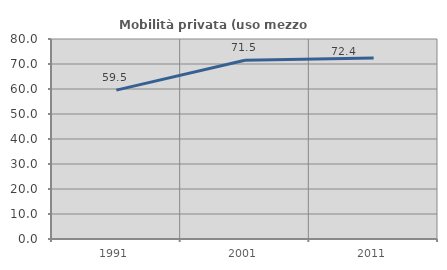
| Category | Mobilità privata (uso mezzo privato) |
|---|---|
| 1991.0 | 59.55 |
| 2001.0 | 71.508 |
| 2011.0 | 72.376 |